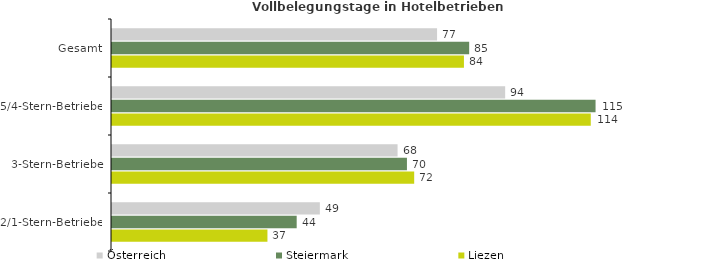
| Category | Österreich | Steiermark | Liezen |
|---|---|---|---|
| Gesamt | 77.394 | 85.042 | 83.794 |
| 5/4-Stern-Betriebe | 93.608 | 115.133 | 113.993 |
| 3-Stern-Betriebe | 67.992 | 70.225 | 71.95 |
| 2/1-Stern-Betriebe | 49.488 | 43.973 | 37.01 |